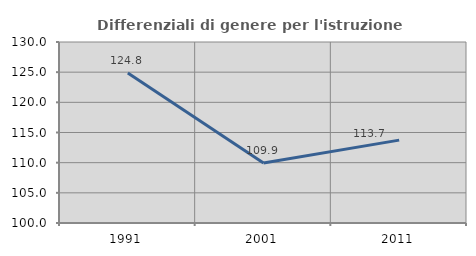
| Category | Differenziali di genere per l'istruzione superiore |
|---|---|
| 1991.0 | 124.842 |
| 2001.0 | 109.932 |
| 2011.0 | 113.738 |